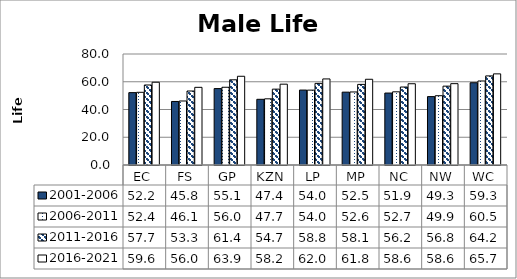
| Category | 2001-2006 | 2006-2011 | 2011-2016 | 2016-2021 |
|---|---|---|---|---|
| EC | 52.161 | 52.398 | 57.661 | 59.641 |
| FS | 45.798 | 46.13 | 53.329 | 55.972 |
| GP | 55.071 | 56.034 | 61.394 | 63.945 |
| KZN | 47.353 | 47.697 | 54.666 | 58.249 |
| LP | 54.001 | 53.962 | 58.829 | 62.03 |
| MP | 52.508 | 52.642 | 58.104 | 61.787 |
| NC | 51.858 | 52.748 | 56.2 | 58.563 |
| NW | 49.299 | 49.936 | 56.829 | 58.62 |
| WC | 59.287 | 60.547 | 64.218 | 65.683 |